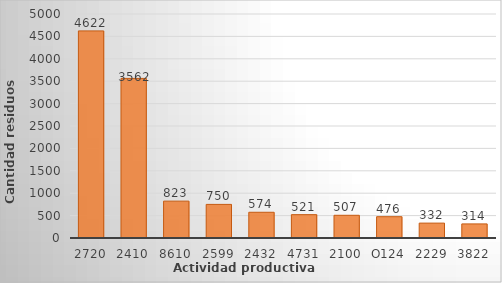
| Category | Series 0 |
|---|---|
| 2720 | 4622.281 |
| 2410 | 3562.017 |
| 8610 | 822.757 |
| 2599 | 749.88 |
| 2432 | 574.149 |
| 4731 | 521.095 |
| 2100 | 506.787 |
| O124 | 475.578 |
| 2229 | 332.17 |
| 3822 | 314.312 |